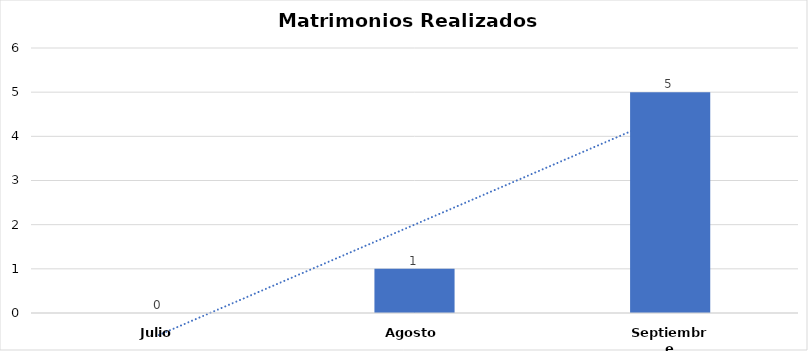
| Category | Series 0 |
|---|---|
| Julio | 0 |
| Agosto | 1 |
| Septiembre | 5 |